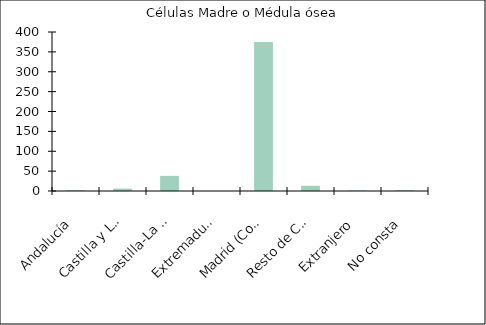
| Category | Células Madre o Médula ósea |
|---|---|
|    Andalucía | 2 |
|    Castilla y León | 6 |
|    Castilla-La Mancha | 38 |
|    Extremadura | 0 |
|    Madrid (Comunidad de) | 375 |
|    Resto de CCAA | 13 |
|    Extranjero | 1 |
|    No consta | 2 |